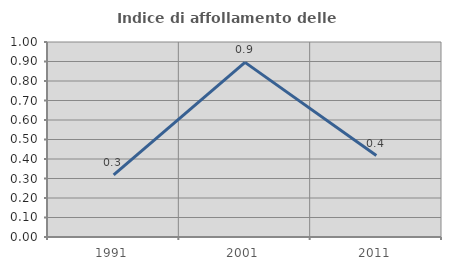
| Category | Indice di affollamento delle abitazioni  |
|---|---|
| 1991.0 | 0.318 |
| 2001.0 | 0.896 |
| 2011.0 | 0.418 |